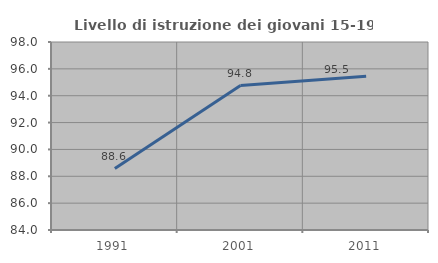
| Category | Livello di istruzione dei giovani 15-19 anni |
|---|---|
| 1991.0 | 88.571 |
| 2001.0 | 94.754 |
| 2011.0 | 95.455 |